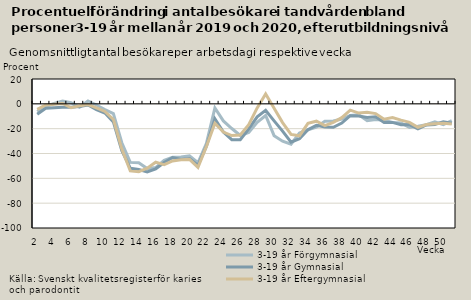
| Category | 3-19 år |
|---|---|
| 2.0 | -4.407 |
| 3.0 | -0.877 |
| 4.0 | -0.368 |
| 5.0 | 0.252 |
| 6.0 | -3.132 |
| 7.0 | -1.592 |
| 8.0 | -0.627 |
| 9.0 | -3.231 |
| 10.0 | -6.097 |
| 11.0 | -12.582 |
| 12.0 | -36.412 |
| 13.0 | -54.05 |
| 14.0 | -54.613 |
| 15.0 | -51.762 |
| 16.0 | -46.97 |
| 17.0 | -48.952 |
| 18.0 | -45.96 |
| 19.0 | -45.057 |
| 20.0 | -44.734 |
| 21.0 | -51.14 |
| 22.0 | -34.246 |
| 23.0 | -15.601 |
| 24.0 | -22.772 |
| 25.0 | -25.558 |
| 26.0 | -25.15 |
| 27.0 | -16.774 |
| 28.0 | -3.245 |
| 29.0 | 7.965 |
| 30.0 | -3.568 |
| 31.0 | -15.08 |
| 32.0 | -24.636 |
| 33.0 | -25.725 |
| 34.0 | -15.713 |
| 35.0 | -13.994 |
| 36.0 | -17.489 |
| 37.0 | -14.864 |
| 38.0 | -11.138 |
| 39.0 | -5.123 |
| 40.0 | -7.449 |
| 41.0 | -6.802 |
| 42.0 | -7.851 |
| 43.0 | -12.43 |
| 44.0 | -10.991 |
| 45.0 | -13.127 |
| 46.0 | -14.968 |
| 47.0 | -18.991 |
| 48.0 | -16.648 |
| 49.0 | -15.982 |
| 50.0 | -15.581 |
| 51.0 | -16.282 |